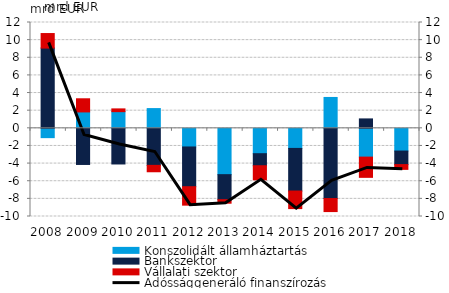
| Category | Konszolidált államháztartás | Bankszektor | Vállalati szektor |
|---|---|---|---|
| 2008.0 | -1.057 | 9.098 | 1.65 |
| 2009.0 | 1.858 | -4.099 | 1.491 |
| 2010.0 | 1.889 | -4.044 | 0.314 |
| 2011.0 | 2.238 | -4.201 | -0.726 |
| 2012.0 | -2.115 | -4.507 | -2.09 |
| 2013.0 | -5.254 | -2.84 | -0.397 |
| 2014.0 | -2.877 | -1.365 | -1.598 |
| 2015.0 | -2.278 | -4.835 | -1.991 |
| 2016.0 | 3.5 | -7.965 | -1.478 |
| 2017.0 | -3.264 | 1.067 | -2.295 |
| 2018.0 | -2.579 | -1.535 | -0.541 |